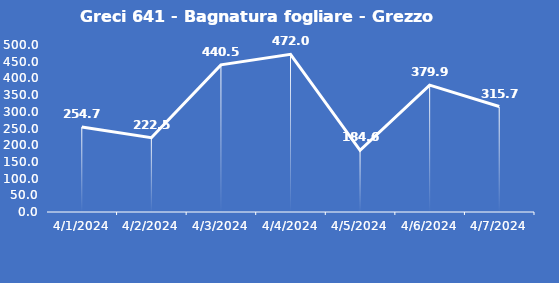
| Category | Greci 641 - Bagnatura fogliare - Grezzo (min) |
|---|---|
| 4/1/24 | 254.7 |
| 4/2/24 | 222.5 |
| 4/3/24 | 440.5 |
| 4/4/24 | 472 |
| 4/5/24 | 184.6 |
| 4/6/24 | 379.9 |
| 4/7/24 | 315.7 |